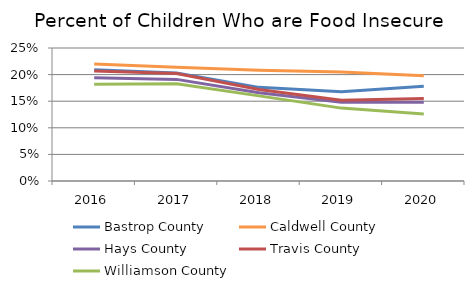
| Category | Bastrop County | Caldwell County | Hays County | Travis County | Williamson County |
|---|---|---|---|---|---|
| 2016.0 | 0.209 | 0.22 | 0.194 | 0.207 | 0.182 |
| 2017.0 | 0.203 | 0.214 | 0.191 | 0.202 | 0.183 |
| 2018.0 | 0.176 | 0.208 | 0.166 | 0.172 | 0.16 |
| 2019.0 | 0.168 | 0.205 | 0.148 | 0.152 | 0.137 |
| 2020.0 | 0.178 | 0.198 | 0.148 | 0.155 | 0.126 |